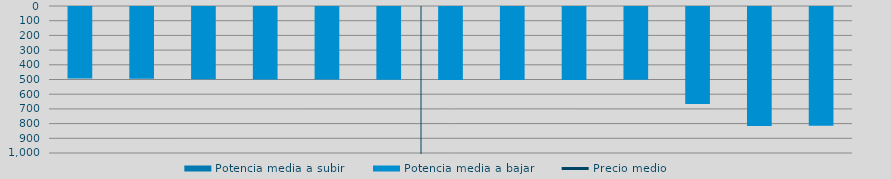
| Category | Potencia media a subir | Potencia media a bajar |
|---|---|---|
| 0 |  | 487.042 |
| 1 |  | 487.609 |
| 2 |  | 490.681 |
| 3 |  | 493.046 |
| 4 |  | 494.01 |
| 5 |  | 494.269 |
| 6 |  | 496 |
| 7 |  | 495.792 |
| 8 |  | 497.176 |
| 9 |  | 494.972 |
| 10 |  | 660 |
| 11 |  | 809.502 |
| 12 |  | 808.05 |